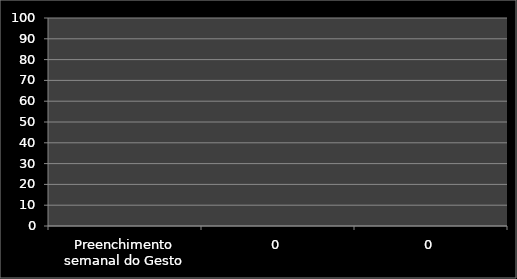
| Category | Inicio % | % |
|---|---|---|
| Preenchimento semanal do Gesto | 0 | 0 |
| 0 | 0 | 0 |
| 0 | 0 | 0 |